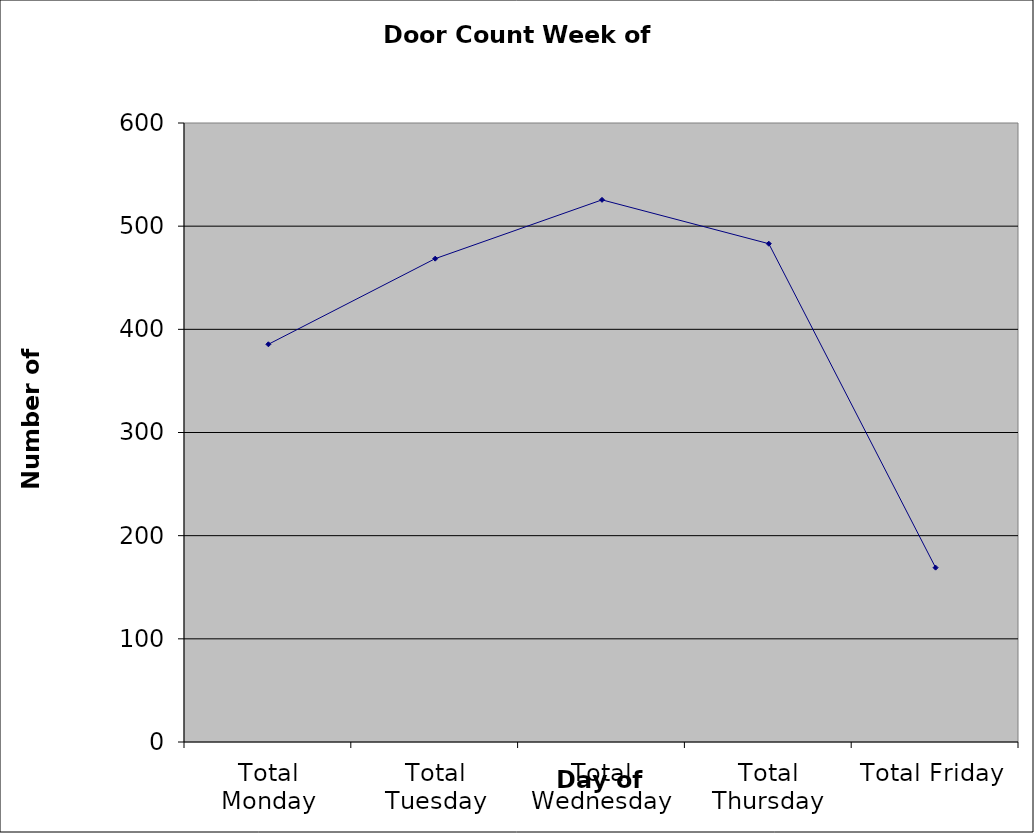
| Category | Series 0 |
|---|---|
| Total Monday | 385.5 |
| Total Tuesday | 468.5 |
| Total Wednesday | 525.5 |
| Total Thursday | 483 |
| Total Friday | 169 |